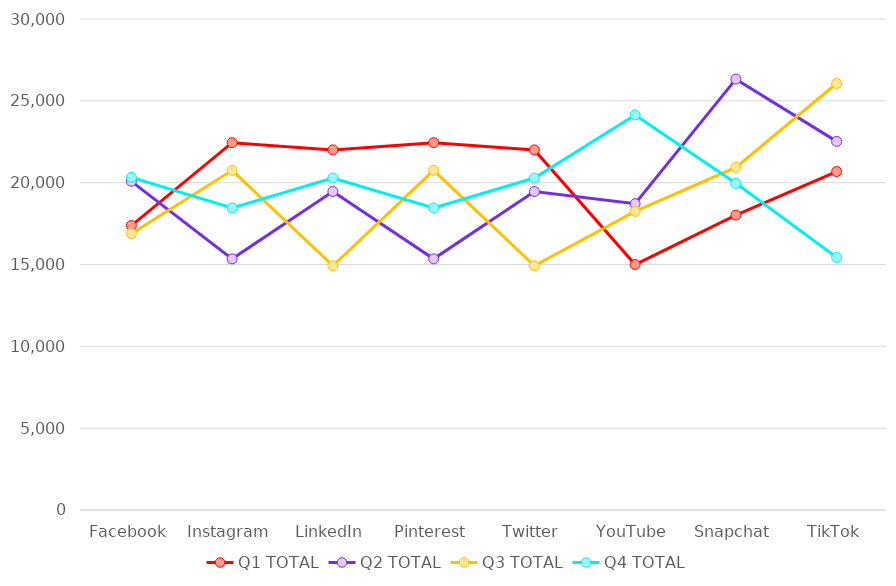
| Category | Q1 TOTAL | Q2 TOTAL | Q3 TOTAL | Q4 TOTAL |
|---|---|---|---|---|
| Facebook | 17380 | 20081 | 16885 | 20326 |
| Instagram | 22444 | 15344 | 20753 | 18456 |
| LinkedIn | 22002 | 19460 | 14923 | 20285 |
| Pinterest | 22444 | 15344 | 20753 | 18456 |
| Twitter | 22002 | 19460 | 14923 | 20285 |
| YouTube | 14997 | 18713 | 18244 | 24136 |
| Snapchat | 18018 | 26325 | 20934 | 19962 |
| TikTok | 20680 | 22523 | 26060 | 15435 |